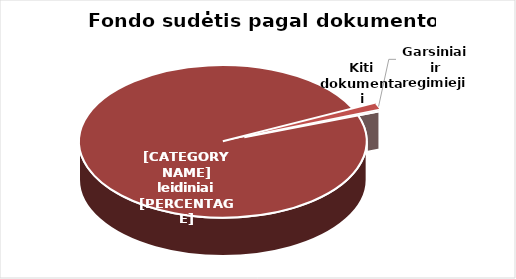
| Category | Series 0 |
|---|---|
| Knygos ir serialiniai | 1990453 |
| Garsiniai ir regimieji | 28340 |
| Kiti dokumentai | 2936 |